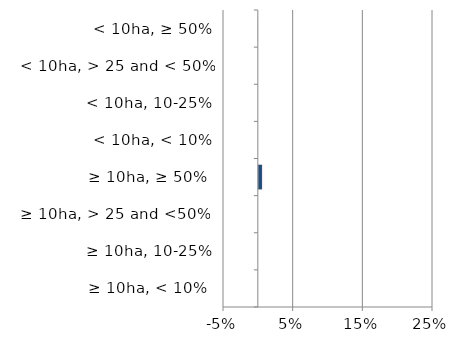
| Category | England | Scotland | Wales |
|---|---|---|---|
|  ≥ 10ha, < 10%  | 0 | 0 | 0 |
|   ≥ 10ha, 10-25% | 0 | 0 | 0 |
|   ≥ 10ha, > 25 and <50%  | 0 | 0 | 0 |
|   ≥ 10ha, ≥ 50%  | 0 | 0.005 | 0 |
|  < 10ha, < 10% | 0 | 0 | 0 |
|  < 10ha, 10-25% | 0 | 0 | 0 |
|  < 10ha, > 25 and < 50% | 0 | 0 | 0 |
|  < 10ha, ≥ 50% | 0 | 0 | 0 |